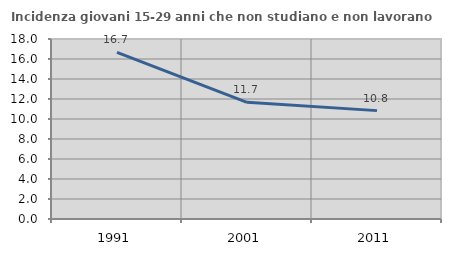
| Category | Incidenza giovani 15-29 anni che non studiano e non lavorano  |
|---|---|
| 1991.0 | 16.667 |
| 2001.0 | 11.664 |
| 2011.0 | 10.837 |